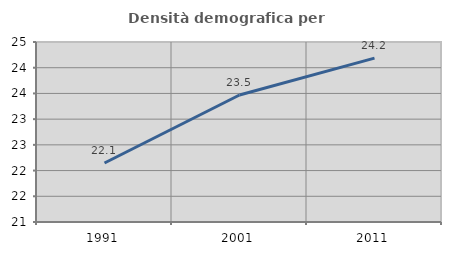
| Category | Densità demografica |
|---|---|
| 1991.0 | 22.147 |
| 2001.0 | 23.47 |
| 2011.0 | 24.186 |